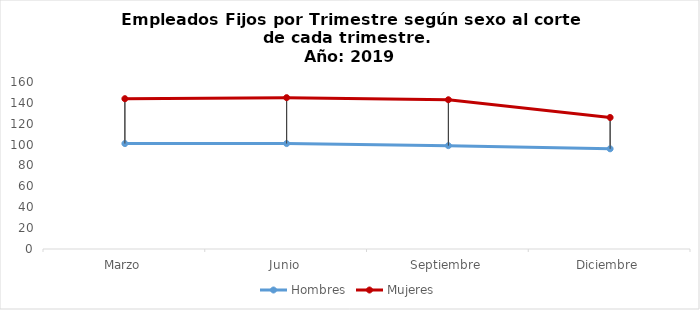
| Category | Hombres | Mujeres |
|---|---|---|
| Marzo | 101 | 144 |
| Junio | 101 | 145 |
| Septiembre | 99 | 143 |
| Diciembre | 96 | 126 |